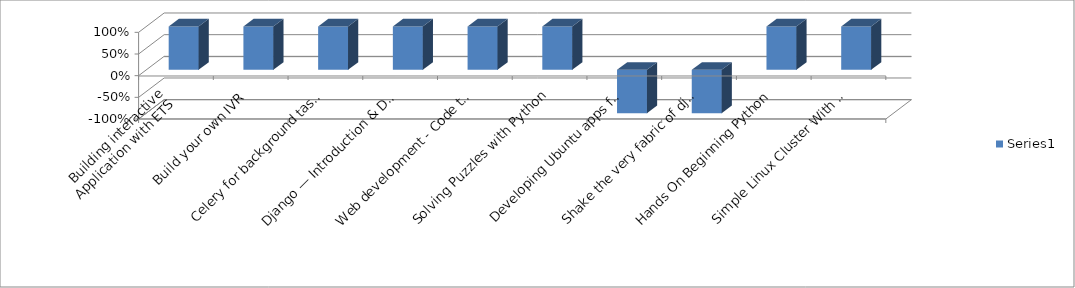
| Category | Series 0 |
|---|---|
| Building interactive Application with ETS
 | 1 |
| Build your own IVR | 3 |
| Celery for background task processing and deferred execution | 3 |
| Django — Introduction & Demo | 7 |
| Web development - Code to Deployment | 7 |
| Solving Puzzles with Python | 18 |
| Developing Ubuntu apps for fun and profit | -2 |
| Shake the very fabric of django deployment woes | -3 |
| Hands On Beginning Python | 8 |
| Simple Linux Cluster With Python and Beanstalkd | 5 |